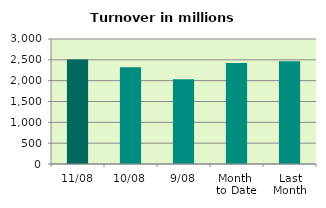
| Category | Series 0 |
|---|---|
| 11/08 | 2509.886 |
| 10/08 | 2319.019 |
| 9/08 | 2033.444 |
| Month 
to Date | 2423.35 |
| Last
Month | 2466.495 |